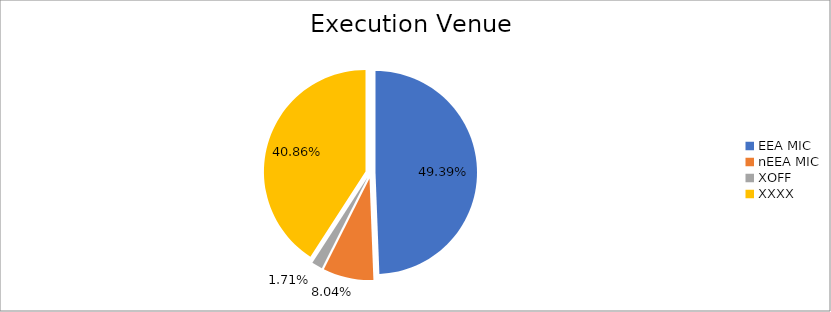
| Category | Series 0 |
|---|---|
| EEA MIC | 5511827.618 |
| nEEA MIC | 897167.324 |
| XOFF | 191130.195 |
| XXXX | 4560696.357 |